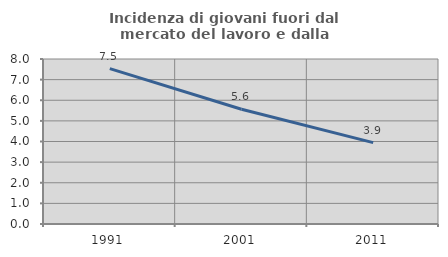
| Category | Incidenza di giovani fuori dal mercato del lavoro e dalla formazione  |
|---|---|
| 1991.0 | 7.534 |
| 2001.0 | 5.562 |
| 2011.0 | 3.947 |